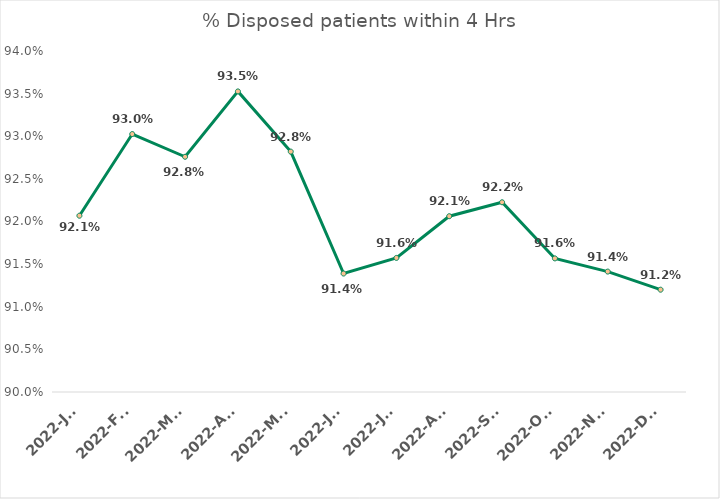
| Category | % Disposed patients within 4 Hrs |
|---|---|
| 2022-Jan | 0.921 |
| 2022-Feb | 0.93 |
| 2022-Mar | 0.928 |
| 2022-Apr | 0.935 |
| 2022-May | 0.928 |
| 2022-Jun | 0.914 |
| 2022-Jul | 0.916 |
| 2022-Aug | 0.921 |
| 2022-Sep | 0.922 |
| 2022-Oct | 0.916 |
| 2022-Nov | 0.914 |
| 2022-Dec | 0.912 |